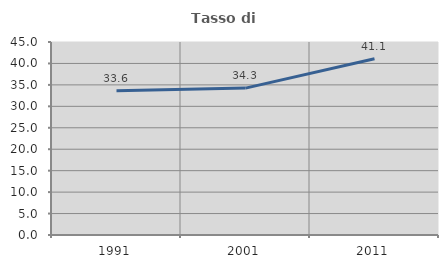
| Category | Tasso di occupazione   |
|---|---|
| 1991.0 | 33.632 |
| 2001.0 | 34.251 |
| 2011.0 | 41.111 |